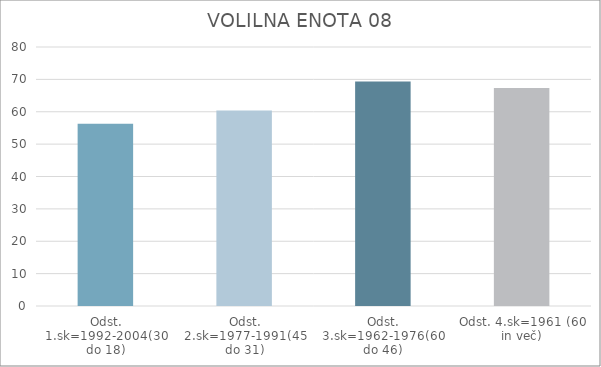
| Category | Series 0 |
|---|---|
| Odst. 1.sk=1992-2004(30 do 18) | 56.31 |
| Odst. 2.sk=1977-1991(45 do 31) | 60.36 |
| Odst. 3.sk=1962-1976(60 do 46) | 69.31 |
| Odst. 4.sk=1961 (60 in več) | 67.31 |